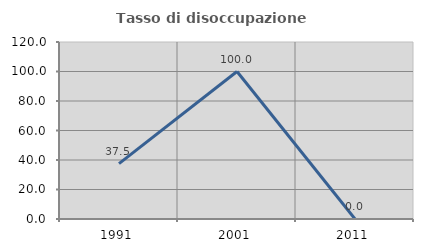
| Category | Tasso di disoccupazione giovanile  |
|---|---|
| 1991.0 | 37.5 |
| 2001.0 | 100 |
| 2011.0 | 0 |